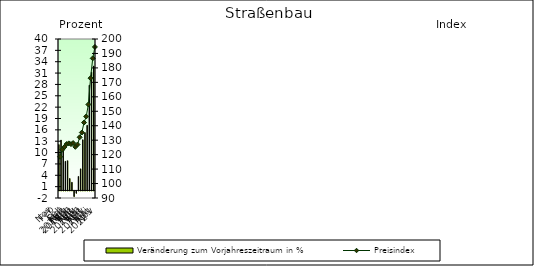
| Category | Veränderung zum Vorjahreszeitraum in % |
|---|---|
| 0 | 12.11 |
| 1 | 13.315 |
| 2 | 11.378 |
| 3 | 7.699 |
| 4 | 7.848 |
| 5 | 3.16 |
| 6 | 2.155 |
| 7 | -1.493 |
| 8 | -0.626 |
| 9 | 3.692 |
| 10 | 5.703 |
| 11 | 13.397 |
| 12 | 15.276 |
| 13 | 17.197 |
| 14 | 27.79 |
| 15 | 31.224 |
| 16 | 32.855 |